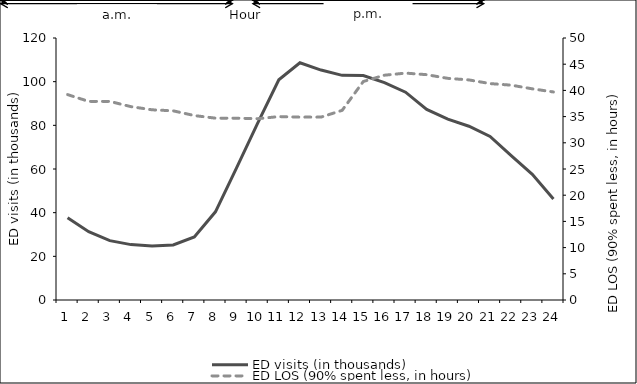
| Category | ED visits (in thousands) |
|---|---|
| 0 | 37.653 |
| 1 | 31.296 |
| 2 | 27.187 |
| 3 | 25.374 |
| 4 | 24.721 |
| 5 | 25.186 |
| 6 | 28.902 |
| 7 | 40.38 |
| 8 | 60.511 |
| 9 | 81.007 |
| 10 | 100.859 |
| 11 | 108.648 |
| 12 | 105.322 |
| 13 | 102.888 |
| 14 | 102.838 |
| 15 | 99.525 |
| 16 | 95.18 |
| 17 | 87.314 |
| 18 | 82.839 |
| 19 | 79.596 |
| 20 | 74.899 |
| 21 | 66.134 |
| 22 | 57.562 |
| 23 | 46.27 |